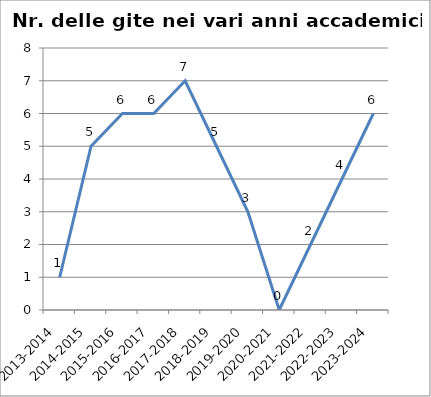
| Category | Nr. Gite Svolte |
|---|---|
| 2013-2014 | 1 |
| 2014-2015 | 5 |
| 2015-2016 | 6 |
| 2016-2017 | 6 |
| 2017-2018 | 7 |
| 2018-2019 | 5 |
| 2019-2020 | 3 |
| 2020-2021 | 0 |
| 2021-2022 | 2 |
| 2022-2023 | 4 |
| 2023-2024 | 6 |